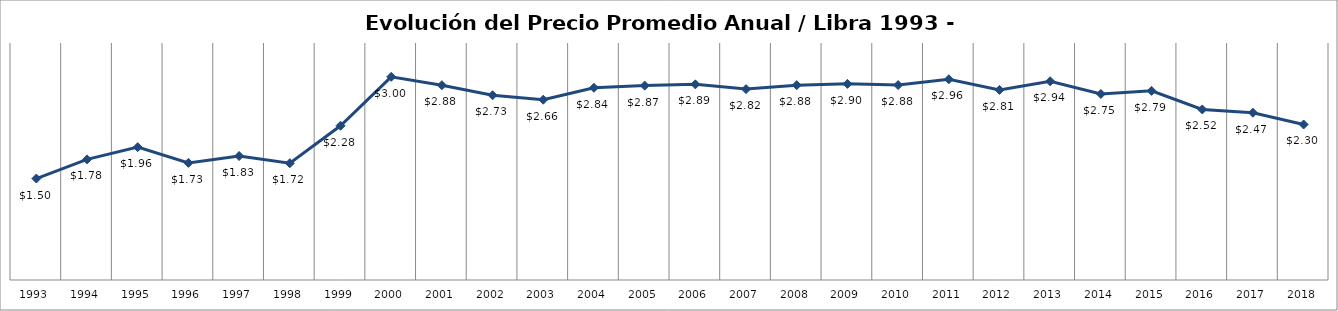
| Category | Series 0 |
|---|---|
| 1993.0 | 1.498 |
| 1994.0 | 1.781 |
| 1995.0 | 1.962 |
| 1996.0 | 1.73 |
| 1997.0 | 1.831 |
| 1998.0 | 1.725 |
| 1999.0 | 2.278 |
| 2000.0 | 3 |
| 2001.0 | 2.877 |
| 2002.0 | 2.728 |
| 2003.0 | 2.662 |
| 2004.0 | 2.839 |
| 2005.0 | 2.871 |
| 2006.0 | 2.889 |
| 2007.0 | 2.819 |
| 2008.0 | 2.877 |
| 2009.0 | 2.896 |
| 2010.0 | 2.879 |
| 2011.0 | 2.965 |
| 2012.0 | 2.807 |
| 2013.0 | 2.935 |
| 2014.0 | 2.748 |
| 2015.0 | 2.793 |
| 2016.0 | 2.519 |
| 2017.0 | 2.47 |
| 2018.0 | 2.297 |